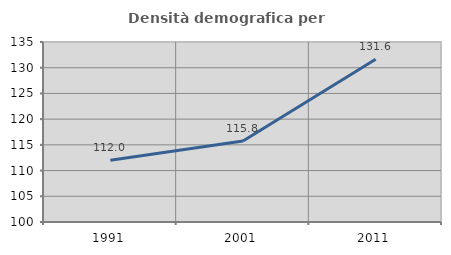
| Category | Densità demografica |
|---|---|
| 1991.0 | 112.025 |
| 2001.0 | 115.752 |
| 2011.0 | 131.644 |